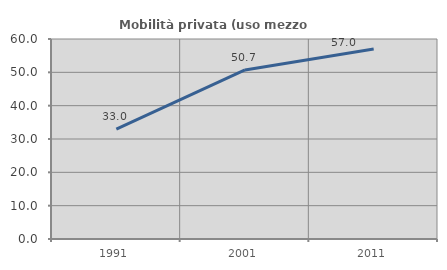
| Category | Mobilità privata (uso mezzo privato) |
|---|---|
| 1991.0 | 32.975 |
| 2001.0 | 50.71 |
| 2011.0 | 56.983 |